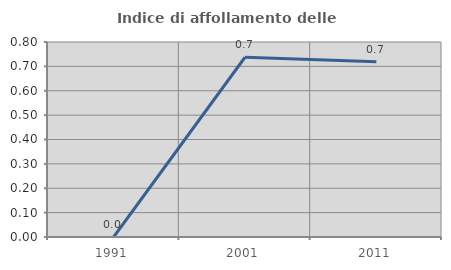
| Category | Indice di affollamento delle abitazioni  |
|---|---|
| 1991.0 | 0 |
| 2001.0 | 0.737 |
| 2011.0 | 0.719 |